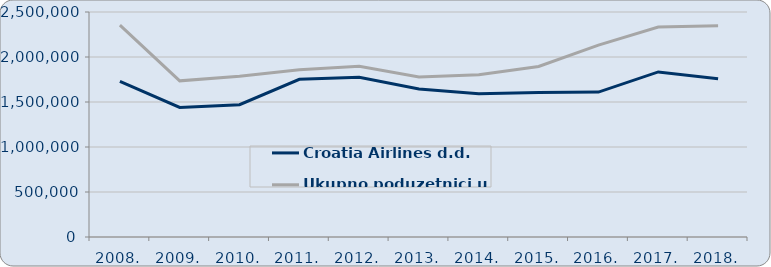
| Category | Croatia Airlines d.d. | Ukupno poduzetnici u odjeljku 51 |
|---|---|---|
| 2008. | 1728599.078 | 2353653.002 |
| 2009. | 1439481.934 | 1735199.625 |
| 2010. | 1469973.464 | 1786943.676 |
| 2011. | 1751944.142 | 1857551.012 |
| 2012. | 1775469.921 | 1897225.561 |
| 2013. | 1644306.304 | 1777036.889 |
| 2014. | 1591934.497 | 1802167 |
| 2015. | 1604607.923 | 1894579.168 |
| 2016. | 1609988.61 | 2132541.951 |
| 2017. | 1833857.834 | 2332865.383 |
| 2018. | 1757578.466 | 2347400.217 |